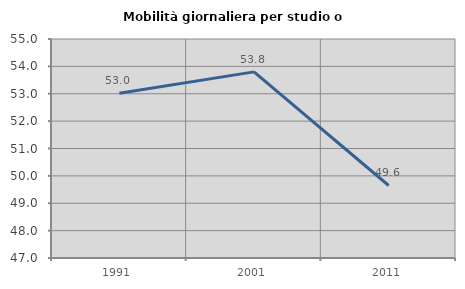
| Category | Mobilità giornaliera per studio o lavoro |
|---|---|
| 1991.0 | 53.018 |
| 2001.0 | 53.798 |
| 2011.0 | 49.649 |